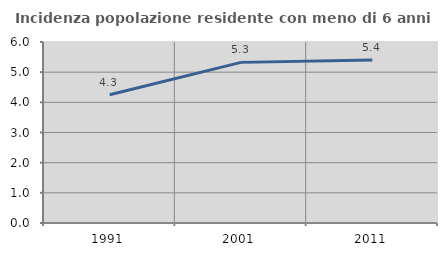
| Category | Incidenza popolazione residente con meno di 6 anni |
|---|---|
| 1991.0 | 4.252 |
| 2001.0 | 5.325 |
| 2011.0 | 5.405 |